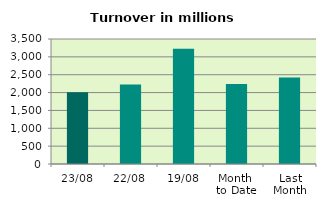
| Category | Series 0 |
|---|---|
| 23/08 | 2008.319 |
| 22/08 | 2228.614 |
| 19/08 | 3225.589 |
| Month 
to Date | 2242.378 |
| Last
Month | 2421.628 |